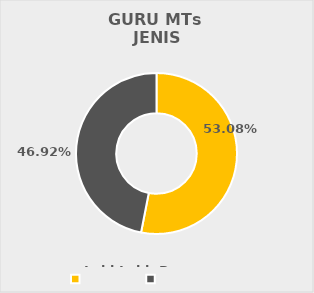
| Category | GURU MTs 
JENIS KELAMIN |
|---|---|
| Laki-Laki | 138 |
| Perempuan | 122 |